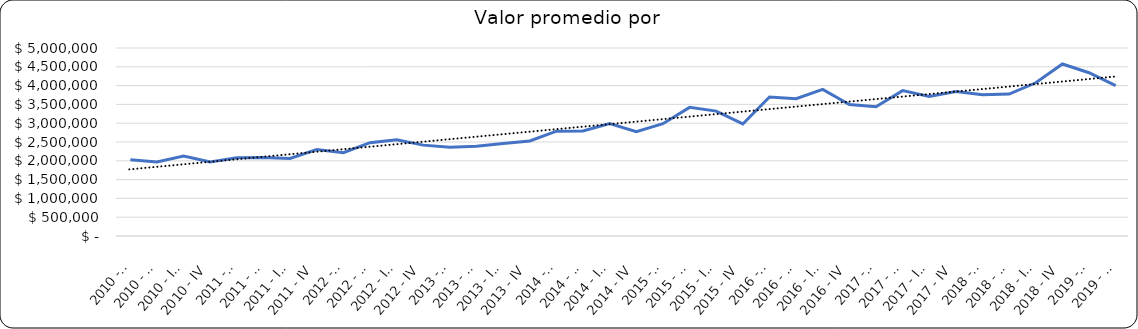
| Category | Valor m2 en Bogotá por sectores |
|---|---|
| 2010 - I | 2027363.184 |
| 2010 - II | 1967661.692 |
| 2010 - III | 2124378.109 |
| 2010 - IV | 1967661.692 |
| 2011 - I | 2082089.552 |
| 2011 - II | 2089552.239 |
| 2011 - III | 2062189.055 |
| 2011 - IV | 2300995.025 |
| 2012 - I | 2215686.275 |
| 2012 - II | 2482843.137 |
| 2012 - III | 2556372.549 |
| 2012 - IV | 2416666.667 |
| 2013 - I | 2360294.118 |
| 2013 - II | 2389705.882 |
| 2013 - III | 2458333.333 |
| 2013 - IV | 2526960.784 |
| 2014 - I | 2789215.686 |
| 2014 - II | 2794117.647 |
| 2014 - III | 2987745.098 |
| 2014 - IV | 2772058.824 |
| 2015 - I | 2987745.098 |
| 2015 - II | 3421568.627 |
| 2015 - III | 3321078.431 |
| 2015 - IV | 2980392.157 |
| 2016 - I | 3697916.667 |
| 2016 - II | 3652173.913 |
| 2016 - III | 3897849.462 |
| 2016 - IV | 3498756.219 |
| 2017 - I | 3437500 |
| 2017 - II | 3865482.234 |
| 2017 - III | 3712871.287 |
| 2017 - IV | 3845000 |
| 2018 - I | 3759124.088 |
| 2018 - II | 3776119.403 |
| 2018 - III | 4075098 |
| 2018 - IV | 4573643 |
| 2019 - I | 4342369 |
| 2019 - II | 4000000 |